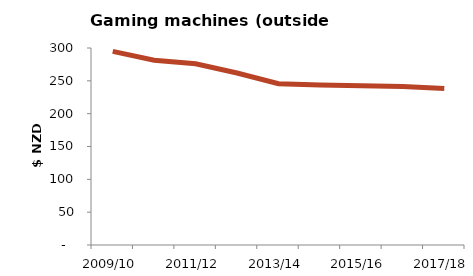
| Category | Inflation adjusted expenditure per capita |
|---|---|
| 2009/10 | 294.839 |
| 2010/11 | 281.363 |
| 2011/12 | 275.927 |
| 2012/13 | 261.85 |
| 2013/14 | 245.663 |
| 2014/15 | 243.472 |
| 2015/16 | 242.394 |
| 2016/17 | 241.537 |
| 2017/18 | 238.18 |